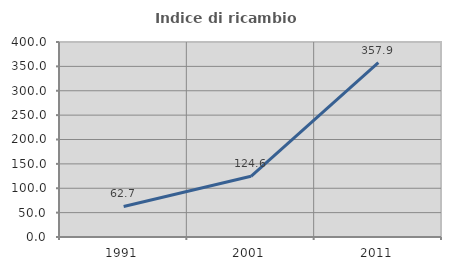
| Category | Indice di ricambio occupazionale  |
|---|---|
| 1991.0 | 62.678 |
| 2001.0 | 124.571 |
| 2011.0 | 357.858 |